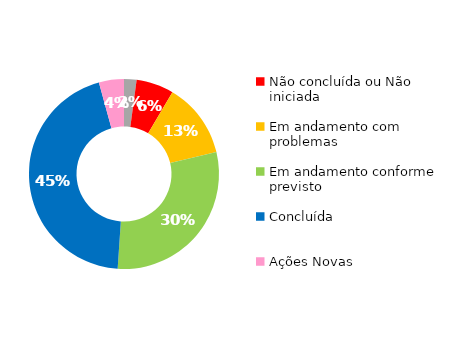
| Category | Series 0 |
|---|---|
| Início planejado posterior | 1 |
| Não concluída ou Não iniciada | 3 |
| Em andamento com problemas | 6 |
| Em andamento conforme previsto | 14 |
| Concluída | 21 |
| Ações Novas | 2 |